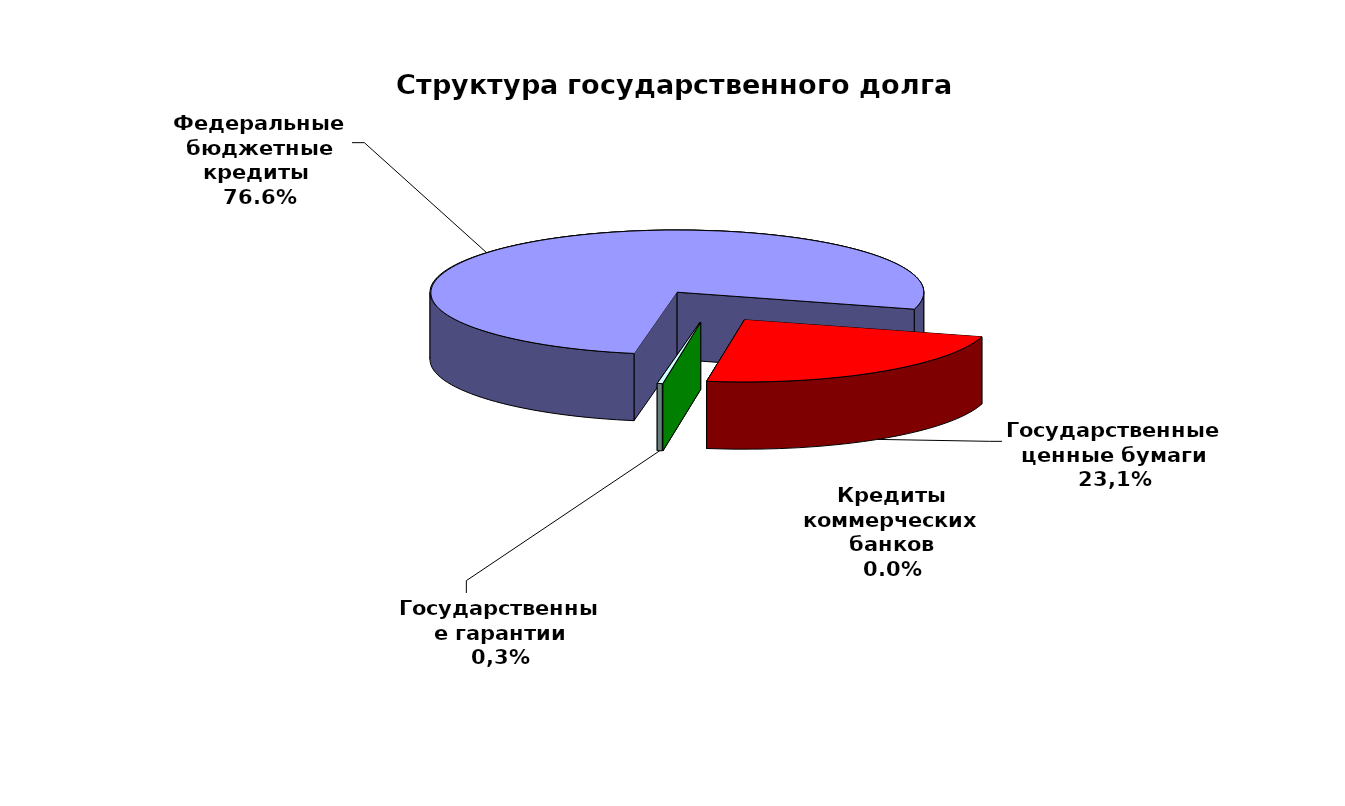
| Category | Series 0 |
|---|---|
| Федеральные бюджетные кредиты  | 113101358.397 |
| Государственные ценные бумаги | 34000000 |
| Кредиты коммерческих банков | 0 |
| Государственные гарантии | 490073.841 |